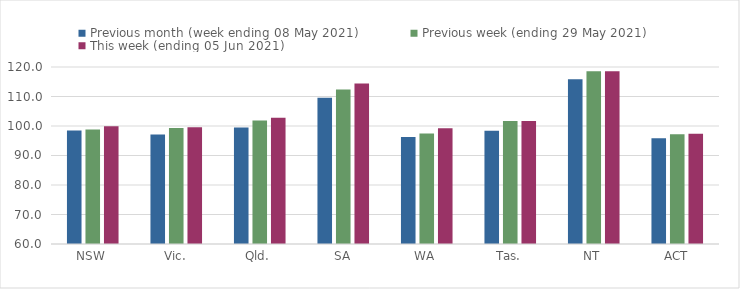
| Category | Previous month (week ending 08 May 2021) | Previous week (ending 29 May 2021) | This week (ending 05 Jun 2021) |
|---|---|---|---|
| NSW | 98.47 | 98.79 | 99.89 |
| Vic. | 97.13 | 99.3 | 99.6 |
| Qld. | 99.46 | 101.86 | 102.78 |
| SA | 109.55 | 112.4 | 114.38 |
| WA | 96.24 | 97.48 | 99.21 |
| Tas. | 98.39 | 101.72 | 101.72 |
| NT | 115.82 | 118.58 | 118.58 |
| ACT | 95.85 | 97.19 | 97.41 |